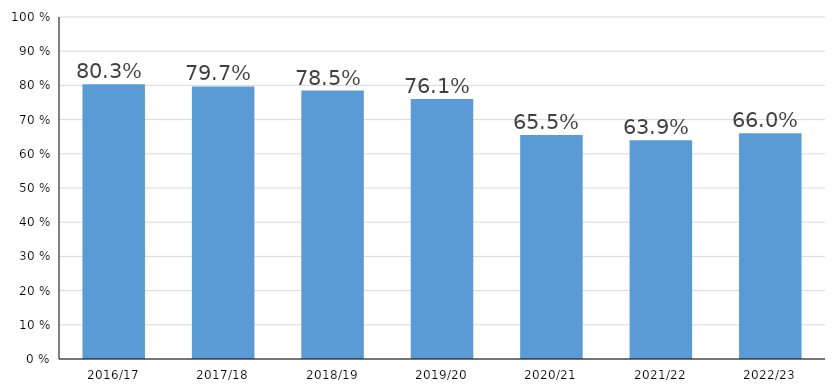
| Category | Series 0 |
|---|---|
| 2016/17 | 0.803 |
| 2017/18 | 0.797 |
| 2018/19 | 0.785 |
| 2019/20 | 0.761 |
| 2020/21 | 0.655 |
| 2021/22 | 0.639 |
| 2022/23 | 0.66 |